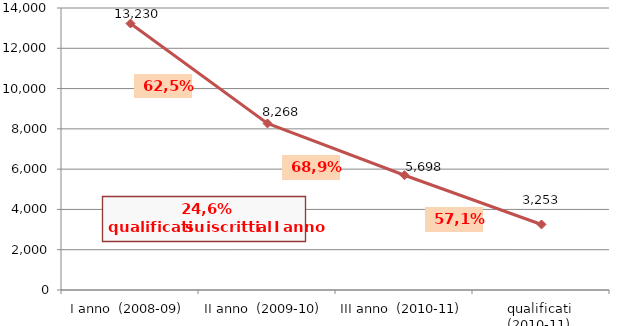
| Category | Series 0 |
|---|---|
| I anno  (2008-09) | 13230 |
| II anno  (2009-10) | 8268 |
| III anno  (2010-11) | 5698 |
| qualificati (2010-11) | 3253 |